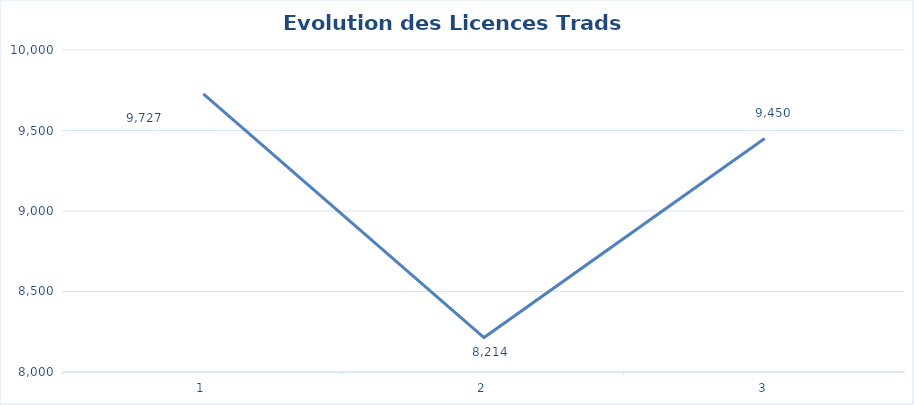
| Category | AURA TRADS |
|---|---|
| 0 | 9727 |
| 1 | 8214 |
| 2 | 9450 |